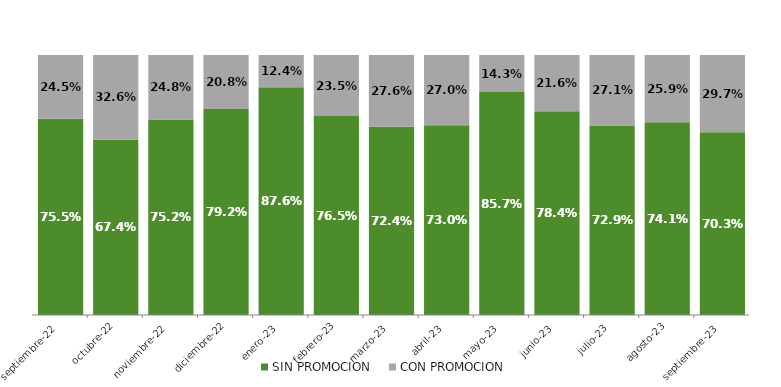
| Category | SIN PROMOCION   | CON PROMOCION   |
|---|---|---|
| 2022-09-01 | 0.755 | 0.245 |
| 2022-10-01 | 0.674 | 0.326 |
| 2022-11-01 | 0.752 | 0.248 |
| 2022-12-01 | 0.792 | 0.208 |
| 2023-01-01 | 0.876 | 0.124 |
| 2023-02-01 | 0.765 | 0.235 |
| 2023-03-01 | 0.724 | 0.276 |
| 2023-04-01 | 0.73 | 0.27 |
| 2023-05-01 | 0.857 | 0.143 |
| 2023-06-01 | 0.784 | 0.216 |
| 2023-07-01 | 0.729 | 0.271 |
| 2023-08-01 | 0.741 | 0.259 |
| 2023-09-01 | 0.703 | 0.297 |